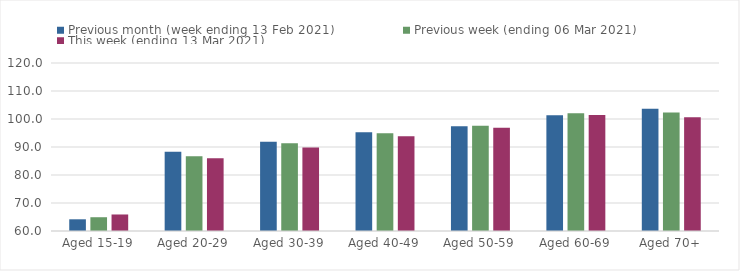
| Category | Previous month (week ending 13 Feb 2021) | Previous week (ending 06 Mar 2021) | This week (ending 13 Mar 2021) |
|---|---|---|---|
| Aged 15-19 | 64.18 | 64.92 | 65.9 |
| Aged 20-29 | 88.33 | 86.69 | 85.98 |
| Aged 30-39 | 91.89 | 91.37 | 89.83 |
| Aged 40-49 | 95.25 | 94.95 | 93.84 |
| Aged 50-59 | 97.37 | 97.61 | 96.9 |
| Aged 60-69 | 101.37 | 102.02 | 101.4 |
| Aged 70+ | 103.67 | 102.31 | 100.61 |